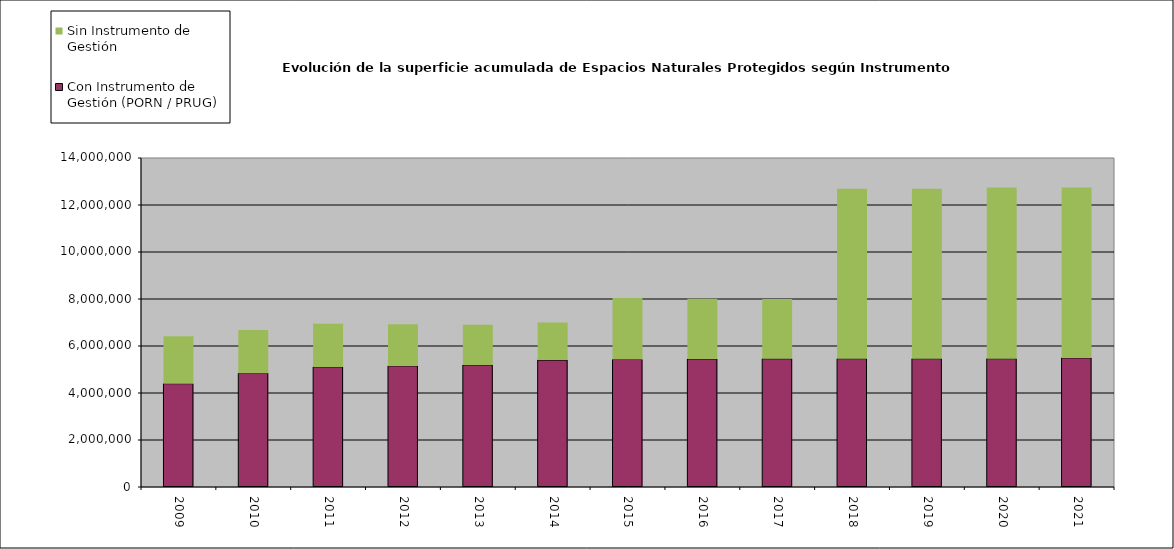
| Category | Con Instrumento de Gestión (PORN / PRUG) | Sin Instrumento de Gestión |
|---|---|---|
| 2009.0 | 4395015.389 | 2016449.15 |
| 2010.0 | 4843131.578 | 1833757.14 |
| 2011.0 | 5109748.061 | 1831920.18 |
| 2012.0 | 5152357.285 | 1775935.99 |
| 2013.0 | 5192144.996 | 1712428.77 |
| 2014.0 | 5399275.751 | 1598299.22 |
| 2015.0 | 5425392.76 | 2612731.19 |
| 2016.0 | 5447431.371 | 2564397.27 |
| 2017.0 | 5454822.808 | 2546575.8 |
| 2018.0 | 5459295.274 | 7228863.44 |
| 2019.0 | 5459295.274 | 7229037.13 |
| 2020.0 | 5459295.274 | 7281073.85 |
| 2021.0 | 5492304.463 | 7252660.721 |